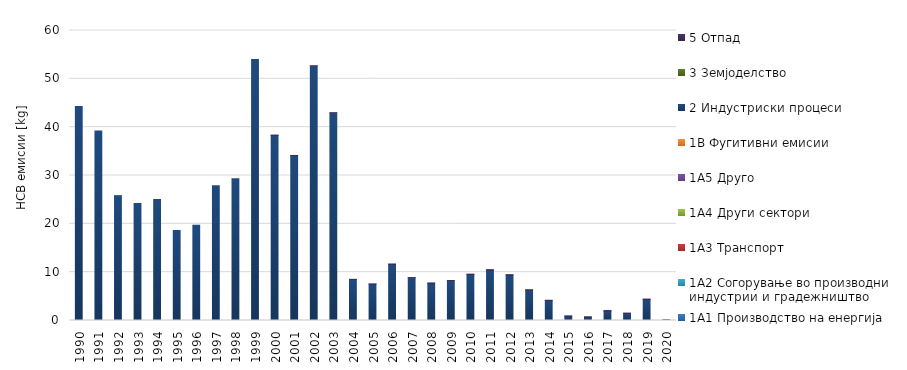
| Category | 1A1 | 1A2 | 1A3 | 1A4 | 1A5 | 1B | 2 | 3 | 5 |
|---|---|---|---|---|---|---|---|---|---|
| 1990 | 0 | 0.003 | 0 | 0.08 | 0 | 0 | 44.205 | 0 | 0 |
| 1991 | 0 | 0.003 | 0 | 0.069 | 0 | 0 | 39.145 | 0 | 0 |
| 1992 | 0 | 0.003 | 0 | 0.075 | 0 | 0 | 25.75 | 0 | 0 |
| 1993 | 0 | 0.003 | 0 | 0.084 | 0 | 0 | 24.095 | 0 | 0 |
| 1994 | 0 | 0.002 | 0 | 0.081 | 0 | 0 | 24.955 | 0 | 0 |
| 1995 | 0 | 0.003 | 0 | 0.081 | 0 | 0 | 18.545 | 0 | 0 |
| 1996 | 0 | 0 | 0 | 0.081 | 0 | 0 | 19.62 | 0 | 0 |
| 1997 | 0 | 0.001 | 0 | 0.081 | 0 | 0 | 27.805 | 0 | 0 |
| 1998 | 0 | 0.005 | 0 | 0.081 | 0 | 0 | 29.25 | 0 | 0 |
| 1999 | 0 | 0.004 | 0 | 0.085 | 0 | 0 | 53.885 | 0 | 0 |
| 2000 | 0 | 0.003 | 0 | 0.1 | 0 | 0 | 38.205 | 0 | 0.011 |
| 2001 | 0 | 0.003 | 0 | 0.075 | 0 | 0 | 34.045 | 0 | 0.023 |
| 2002 | 0 | 0.002 | 0 | 0.076 | 0 | 0 | 52.58 | 0 | 0.025 |
| 2003 | 0 | 0.003 | 0 | 0.084 | 0 | 0 | 42.865 | 0 | 0.026 |
| 2004 | 0 | 0.003 | 0 | 0.085 | 0 | 0 | 8.395 | 0 | 0.032 |
| 2005 | 0 | 0.015 | 0 | 0.046 | 0 | 0 | 7.445 | 0 | 0.038 |
| 2006 | 0 | 0.005 | 0 | 0.046 | 0 | 0 | 11.58 | 0 | 0.033 |
| 2007 | 0 | 0.005 | 0 | 0.043 | 0 | 0 | 8.785 | 0 | 0.036 |
| 2008 | 0 | 0.005 | 0 | 0.043 | 0 | 0 | 7.655 | 0 | 0.036 |
| 2009 | 0 | 0.003 | 0 | 0.045 | 0 | 0 | 8.185 | 0 | 0.042 |
| 2010 | 0 | 0.005 | 0 | 0.044 | 0 | 0 | 9.485 | 0 | 0.047 |
| 2011 | 0 | 0.004 | 0 | 0.045 | 0 | 0 | 10.395 | 0 | 0.06 |
| 2012 | 0 | 0.005 | 0 | 0.05 | 0 | 0 | 9.35 | 0 | 0.068 |
| 2013 | 0 | 0.004 | 0 | 0.049 | 0 | 0 | 6.225 | 0 | 0.073 |
| 2014 | 0 | 0.005 | 0 | 0.048 | 0 | 0 | 4.06 | 0 | 0.073 |
| 2015 | 0 | 0.004 | 0 | 0.05 | 0 | 0 | 0.805 | 0 | 0.096 |
| 2016 | 0 | 0.006 | 0 | 0.048 | 0 | 0 | 0.61 | 0 | 0.102 |
| 2017 | 0 | 0.004 | 0 | 0.041 | 0 | 0 | 1.91 | 0 | 0.106 |
| 2018 | 0 | 0.005 | 0 | 0.039 | 0 | 0 | 1.39 | 0 | 0.097 |
| 2019 | 0 | 0.005 | 0 | 0.04 | 0 | 0 | 4.285 | 0 | 0.1 |
| 2020 | 0 | 0.006 | 0 | 0.041 | 0 | 0 | 0 | 0 | 0.107 |